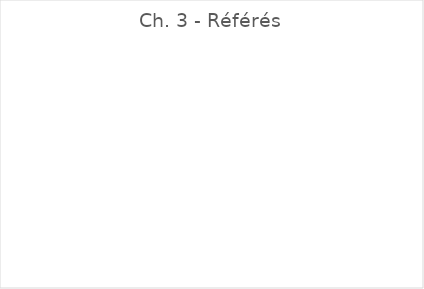
| Category | Ch. 3 - Référés |
|---|---|
| A. DAMERON | 0 |
| N. de SCHONEN | 0 |
| G. PLOCQ | 0 |
| J.-F. JAVIER | 0 |
| J. PARADIS | 0 |
| F. JACQUIER | 0 |
| Ph. BONDUELLE | 0 |
| P. DELABARRE | 0 |
| A. SCHEID | 0 |
| O. TASSAN | 0 |
| Ch. COTELLE | 0 |
| M. DAVID | 0 |
| D. DAEVIDIAK | 0 |